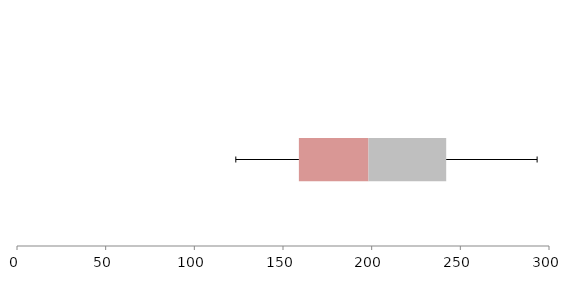
| Category | Series 1 | Series 2 | Series 3 |
|---|---|---|---|
| 0 | 158.956 | 39.258 | 43.817 |